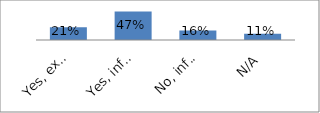
| Category | Series 0 |
|---|---|
| Yes, extensive information on financial assets is presented | 0.211 |
| Yes, information is presented, highlighting key information | 0.474 |
| No, information on financial assets is not presented | 0.158 |
| N/A | 0.105 |